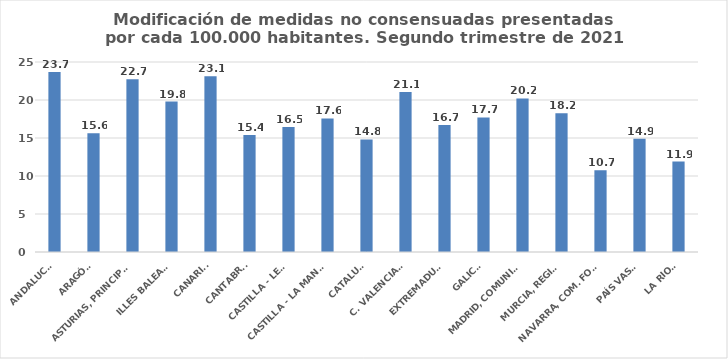
| Category | Series 0 |
|---|---|
| ANDALUCÍA | 23.671 |
| ARAGÓN | 15.618 |
| ASTURIAS, PRINCIPADO | 22.737 |
| ILLES BALEARS | 19.79 |
| CANARIAS | 23.119 |
| CANTABRIA | 15.403 |
| CASTILLA - LEÓN | 16.462 |
| CASTILLA - LA MANCHA | 17.58 |
| CATALUÑA | 14.813 |
| C. VALENCIANA | 21.052 |
| EXTREMADURA | 16.718 |
| GALICIA | 17.704 |
| MADRID, COMUNIDAD | 20.206 |
| MURCIA, REGIÓN | 18.248 |
| NAVARRA, COM. FORAL | 10.741 |
| PAÍS VASCO | 14.915 |
| LA RIOJA | 11.904 |